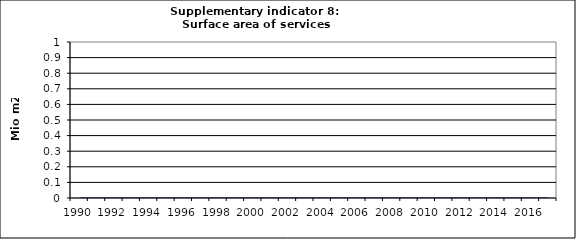
| Category | Surface area of services buildings, Mio m2 |
|---|---|
| 1990 | 0 |
| 1991 | 0 |
| 1992 | 0 |
| 1993 | 0 |
| 1994 | 0 |
| 1995 | 0 |
| 1996 | 0 |
| 1997 | 0 |
| 1998 | 0 |
| 1999 | 0 |
| 2000 | 0 |
| 2001 | 0 |
| 2002 | 0 |
| 2003 | 0 |
| 2004 | 0 |
| 2005 | 0 |
| 2006 | 0 |
| 2007 | 0 |
| 2008 | 0 |
| 2009 | 0 |
| 2010 | 0 |
| 2011 | 0 |
| 2012 | 0 |
| 2013 | 0 |
| 2014 | 0 |
| 2015 | 0 |
| 2016 | 0 |
| 2017 | 0 |